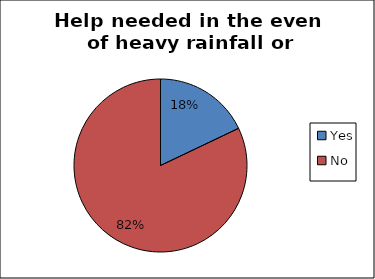
| Category | Series 0 |
|---|---|
| Yes | 0.179 |
| No | 0.821 |